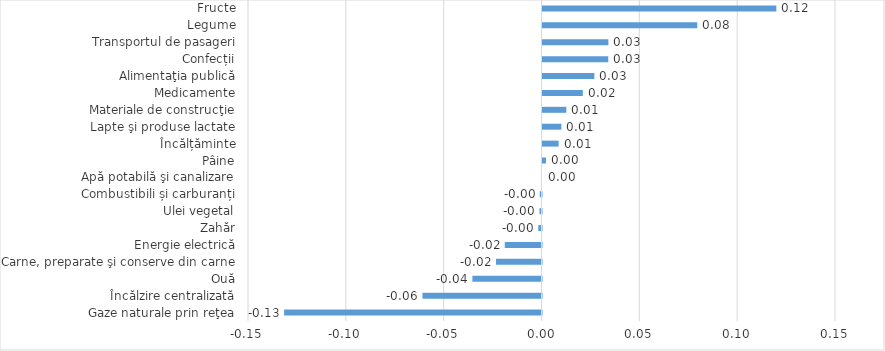
| Category | Series 0 |
|---|---|
| Gaze naturale prin reţea | -0.132 |
| Încălzire centralizată | -0.061 |
| Ouă | -0.035 |
| Carne, preparate şi conserve din carne | -0.023 |
| Energie electrică | -0.019 |
| Zahăr | -0.002 |
| Ulei vegetal | -0.001 |
| Combustibili și carburanți | -0.001 |
| Apă potabilă şi canalizare | 0 |
| Pâine | 0.002 |
| Încălțăminte | 0.008 |
| Lapte şi produse lactate | 0.01 |
| Materiale de construcţie | 0.012 |
| Medicamente | 0.021 |
| Alimentaţia publică | 0.027 |
| Confecții | 0.034 |
| Transportul de pasageri | 0.034 |
| Legume | 0.079 |
| Fructe | 0.12 |